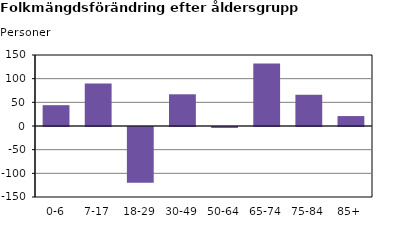
| Category | Series 2 |
|---|---|
| 0-6 | 44 |
| 7-17 | 90 |
| 18-29 | -118 |
| 30-49 | 67 |
| 50-64 | -2 |
| 65-74 | 132 |
| 75-84 | 66 |
| 85+ | 21 |